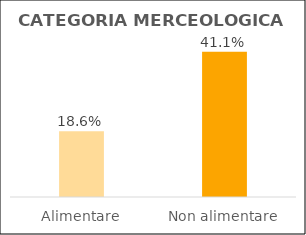
| Category | Series 0 |
|---|---|
| Alimentare | 0.186 |
| Non alimentare | 0.411 |